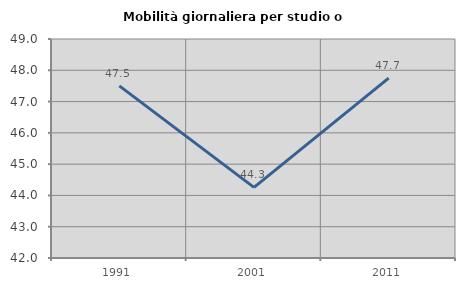
| Category | Mobilità giornaliera per studio o lavoro |
|---|---|
| 1991.0 | 47.502 |
| 2001.0 | 44.257 |
| 2011.0 | 47.749 |